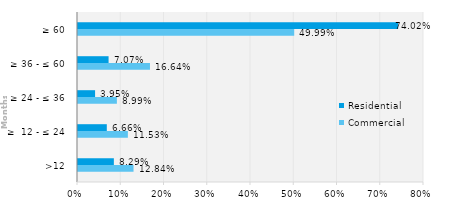
| Category | Commercial | Residential |
|---|---|---|
| >12 | 0.128 | 0.083 |
| ≥  12 - ≤ 24 | 0.115 | 0.067 |
| ≥ 24 - ≤ 36 | 0.09 | 0.04 |
| ≥ 36 - ≤ 60 | 0.166 | 0.071 |
| ≥ 60 | 0.5 | 0.74 |